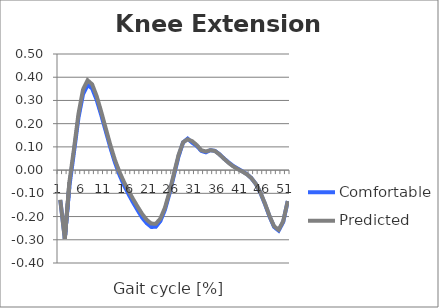
| Category | Comfortable | Predicted |
|---|---|---|
| 0 | -0.129 | -0.128 |
| 1 | -0.295 | -0.296 |
| 2 | -0.07 | -0.051 |
| 3 | 0.076 | 0.09 |
| 4 | 0.226 | 0.242 |
| 5 | 0.327 | 0.347 |
| 6 | 0.366 | 0.387 |
| 7 | 0.352 | 0.369 |
| 8 | 0.302 | 0.319 |
| 9 | 0.237 | 0.251 |
| 10 | 0.168 | 0.18 |
| 11 | 0.098 | 0.108 |
| 12 | 0.034 | 0.045 |
| 13 | -0.02 | -0.007 |
| 14 | -0.065 | -0.051 |
| 15 | -0.103 | -0.089 |
| 16 | -0.139 | -0.124 |
| 17 | -0.172 | -0.157 |
| 18 | -0.205 | -0.189 |
| 19 | -0.229 | -0.214 |
| 20 | -0.245 | -0.23 |
| 21 | -0.244 | -0.231 |
| 22 | -0.22 | -0.209 |
| 23 | -0.171 | -0.162 |
| 24 | -0.102 | -0.095 |
| 25 | -0.021 | -0.014 |
| 26 | 0.059 | 0.065 |
| 27 | 0.119 | 0.12 |
| 28 | 0.135 | 0.133 |
| 29 | 0.118 | 0.125 |
| 30 | 0.104 | 0.108 |
| 31 | 0.083 | 0.086 |
| 32 | 0.077 | 0.08 |
| 33 | 0.086 | 0.086 |
| 34 | 0.083 | 0.082 |
| 35 | 0.068 | 0.067 |
| 36 | 0.05 | 0.049 |
| 37 | 0.033 | 0.031 |
| 38 | 0.018 | 0.016 |
| 39 | 0.006 | 0.005 |
| 40 | -0.005 | -0.006 |
| 41 | -0.017 | -0.018 |
| 42 | -0.034 | -0.034 |
| 43 | -0.06 | -0.06 |
| 44 | -0.098 | -0.097 |
| 45 | -0.146 | -0.144 |
| 46 | -0.2 | -0.197 |
| 47 | -0.245 | -0.242 |
| 48 | -0.26 | -0.257 |
| 49 | -0.224 | -0.22 |
| 50 | -0.133 | -0.133 |